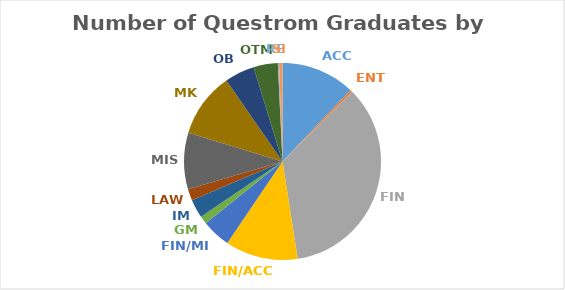
| Category | Series 0 |
|---|---|
| ACC | 64 |
| ENT | 2 |
| FIN | 185 |
| FIN/ACC | 63 |
| FIN/MIS | 25 |
| GM | 7 |
| IM | 16 |
| LAW | 10 |
| MIS | 49 |
| MK | 56 |
| OB | 26 |
| OTM | 21 |
| RE | 1 |
| SI | 3 |